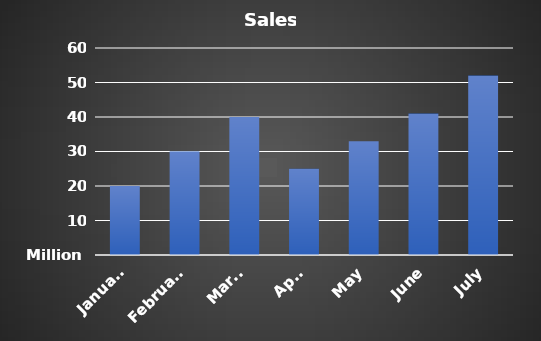
| Category | Series 0 |
|---|---|
| January | 20000000 |
| February | 30000000 |
| March | 40000000 |
| April | 25000000 |
| May | 33000000 |
| June | 41000000 |
| July | 52000000 |